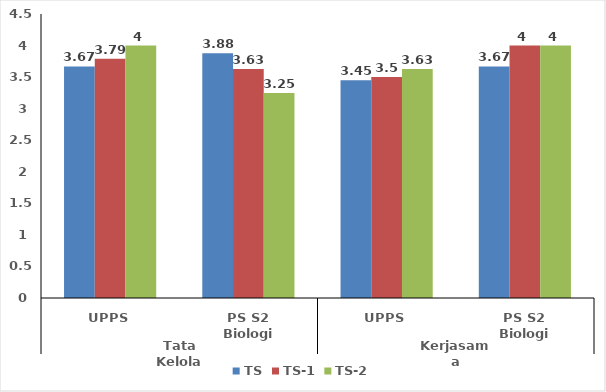
| Category | TS | TS-1 | TS-2 |
|---|---|---|---|
| 0 | 3.67 | 3.79 | 4 |
| 1 | 3.88 | 3.63 | 3.25 |
| 2 | 3.45 | 3.5 | 3.63 |
| 3 | 3.67 | 4 | 4 |